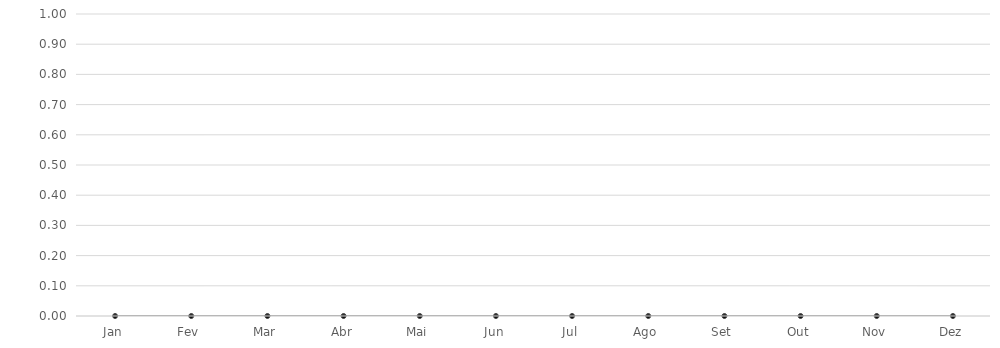
| Category |  R$ -    | Series 1 | Evolução do Patrimônio Líquido |
|---|---|---|---|
| Jan | 0 |  |  |
| Fev | 0 |  |  |
| Mar | 0 |  |  |
| Abr | 0 |  |  |
| Mai | 0 |  |  |
| Jun | 0 |  |  |
| Jul | 0 |  |  |
| Ago | 0 |  |  |
| Set | 0 |  |  |
| Out | 0 |  |  |
| Nov | 0 |  |  |
| Dez | 0 |  |  |